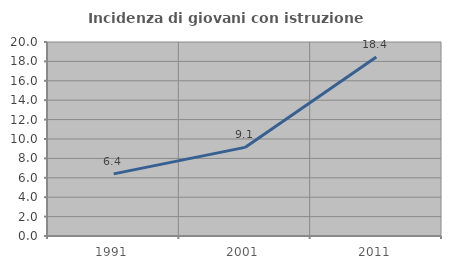
| Category | Incidenza di giovani con istruzione universitaria |
|---|---|
| 1991.0 | 6.408 |
| 2001.0 | 9.135 |
| 2011.0 | 18.45 |